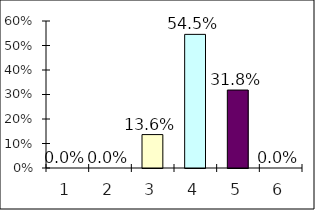
| Category | Series 0 |
|---|---|
| 0 | 0 |
| 1 | 0 |
| 2 | 0.136 |
| 3 | 0.545 |
| 4 | 0.318 |
| 5 | 0 |